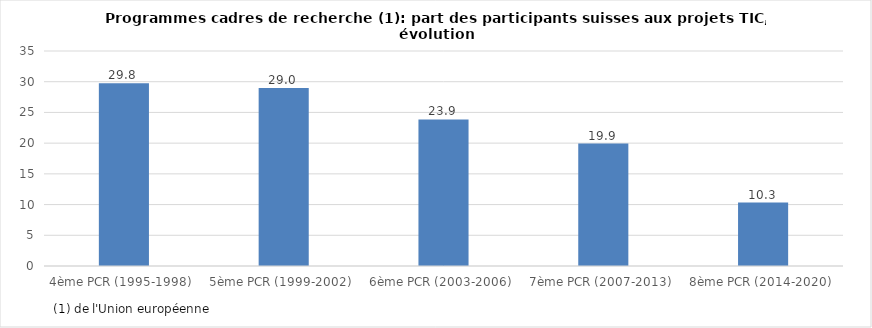
| Category | Series 0 |
|---|---|
| 4ème PCR (1995-1998)  | 29.759 |
| 5ème PCR (1999-2002)  | 28.988 |
| 6ème PCR (2003-2006)  | 23.852 |
| 7ème PCR (2007-2013)  | 19.94 |
| 8ème PCR (2014-2020)  | 10.33 |